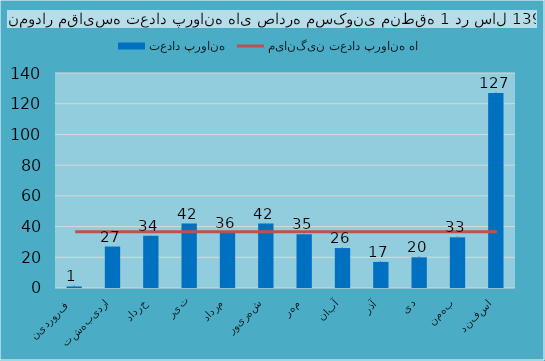
| Category | تعداد پروانه |
|---|---|
| فروردین  | 1 |
| اردیبهشت | 27 |
| خرداد | 34 |
| تیر | 42 |
| مرداد | 36 |
| شهریور | 42 |
| مهر | 35 |
| آبان | 26 |
| آذر | 17 |
| دی | 20 |
| بهمن | 33 |
| اسفند | 127 |